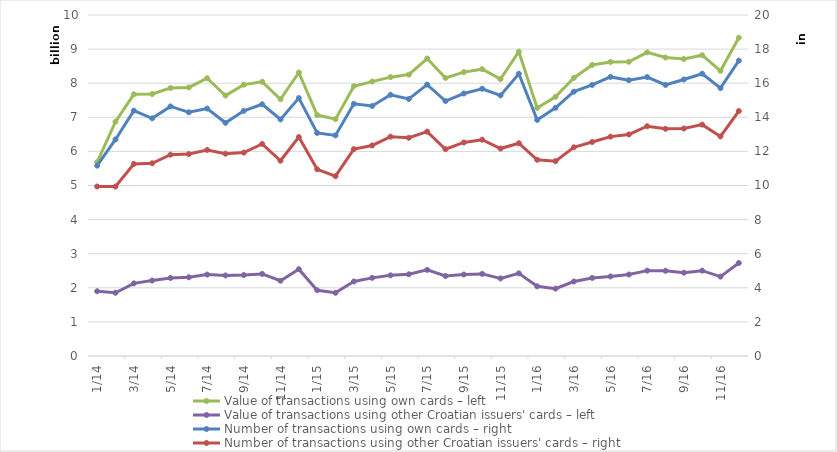
| Category | Value of transactions using own cards – left | Value of transactions using other Croatian issuers' cards – left |
|---|---|---|
| 2014-01-01 | 5687247363 | 1898593012 |
| 2014-02-01 | 6870063020 | 1855463907 |
| 2014-03-01 | 7674667102 | 2129994976 |
| 2014-04-01 | 7682026915 | 2212621583 |
| 2014-05-01 | 7858147469 | 2289145547 |
| 2014-06-01 | 7875143949 | 2308859849 |
| 2014-07-01 | 8145109619 | 2388536724 |
| 2014-08-01 | 7638237735 | 2362083538 |
| 2014-09-01 | 7957831033 | 2372481868 |
| 2014-10-01 | 8040341932 | 2406911162 |
| 2014-11-01 | 7528979185 | 2206276195 |
| 2014-12-01 | 8313079111 | 2546865094 |
| 2015-01-01 | 7064994843 | 1929030428 |
| 2015-02-01 | 6946593821 | 1853442353 |
| 2015-03-01 | 7912165174 | 2184893592 |
| 2015-04-01 | 8047410707 | 2291375278 |
| 2015-05-01 | 8177632963 | 2365055111 |
| 2015-06-01 | 8252429615 | 2396883379 |
| 2015-07-01 | 8723683467 | 2525158845 |
| 2015-08-01 | 8154008999 | 2348138964 |
| 2015-09-01 | 8324374117 | 2388891653 |
| 2015-10-01 | 8411020213 | 2408144476 |
| 2015-11-01 | 8119141285 | 2274247405 |
| 2015-12-01 | 8921936214 | 2423770136 |
| 2016-01-01 | 7274581698 | 2043165117 |
| 2016-02-01 | 7601069776 | 1975751262 |
| 2016-03-01 | 8154515803 | 2184810922 |
| 2016-04-01 | 8536006184 | 2289803134 |
| 2016-05-01 | 8622612405 | 2332785770 |
| 2016-06-01 | 8629034970 | 2389942571 |
| 2016-07-01 | 8904025504 | 2503371795 |
| 2016-08-01 | 8753008570 | 2499535388 |
| 2016-09-01 | 8709318074 | 2442949613 |
| 2016-10-01 | 8820702928 | 2502592179 |
| 2016-11-01 | 8362820758 | 2327194409 |
| 2016-12-01 | 9332637687 | 2726346925 |